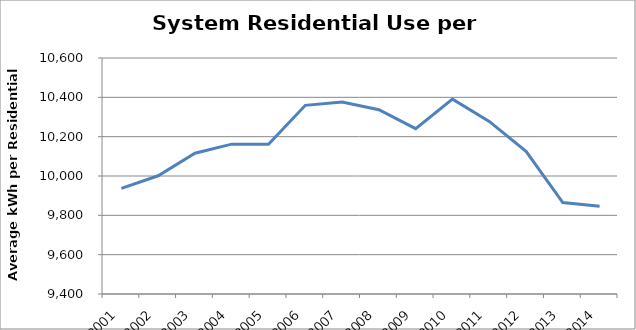
| Category | Series 0 |
|---|---|
| 2001.0 | 9937.134 |
| 2002.0 | 10001.164 |
| 2003.0 | 10115.728 |
| 2004.0 | 10162.03 |
| 2005.0 | 10160.835 |
| 2006.0 | 10359.272 |
| 2007.0 | 10376.059 |
| 2008.0 | 10336.761 |
| 2009.0 | 10240.576 |
| 2010.0 | 10390.55 |
| 2011.0 | 10277.718 |
| 2012.0 | 10125.098 |
| 2013.0 | 9864.88 |
| 2014.0 | 9845.633 |